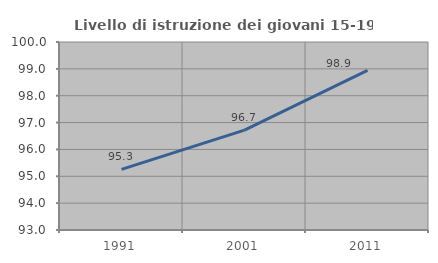
| Category | Livello di istruzione dei giovani 15-19 anni |
|---|---|
| 1991.0 | 95.255 |
| 2001.0 | 96.721 |
| 2011.0 | 98.942 |